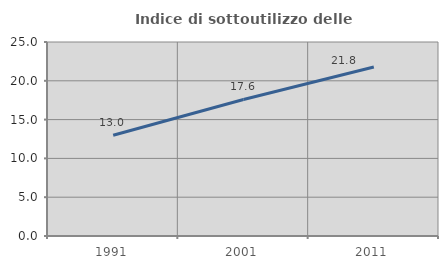
| Category | Indice di sottoutilizzo delle abitazioni  |
|---|---|
| 1991.0 | 12.975 |
| 2001.0 | 17.595 |
| 2011.0 | 21.774 |